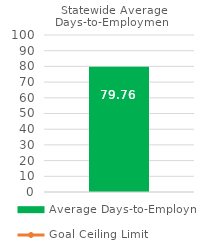
| Category | Average Days-to-Employment |
|---|---|
| 0 | 79.764 |